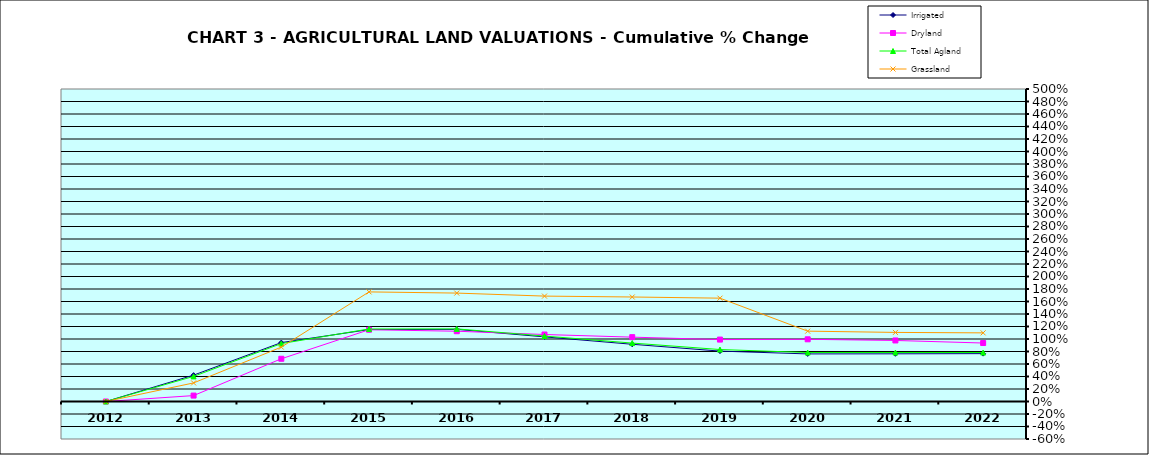
| Category | Irrigated | Dryland | Total Agland | Grassland |
|---|---|---|---|---|
| 2012.0 | 0 | 0 | 0 | 0 |
| 2013.0 | 0.422 | 0.095 | 0.402 | 0.297 |
| 2014.0 | 0.943 | 0.684 | 0.927 | 0.87 |
| 2015.0 | 1.151 | 1.148 | 1.161 | 1.754 |
| 2016.0 | 1.154 | 1.124 | 1.162 | 1.735 |
| 2017.0 | 1.034 | 1.072 | 1.047 | 1.686 |
| 2018.0 | 0.916 | 1.03 | 0.935 | 1.672 |
| 2019.0 | 0.806 | 0.991 | 0.832 | 1.653 |
| 2020.0 | 0.761 | 0.995 | 0.783 | 1.126 |
| 2021.0 | 0.763 | 0.977 | 0.784 | 1.105 |
| 2022.0 | 0.766 | 0.936 | 0.784 | 1.098 |